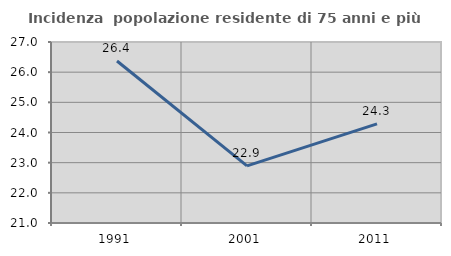
| Category | Incidenza  popolazione residente di 75 anni e più |
|---|---|
| 1991.0 | 26.37 |
| 2001.0 | 22.892 |
| 2011.0 | 24.286 |